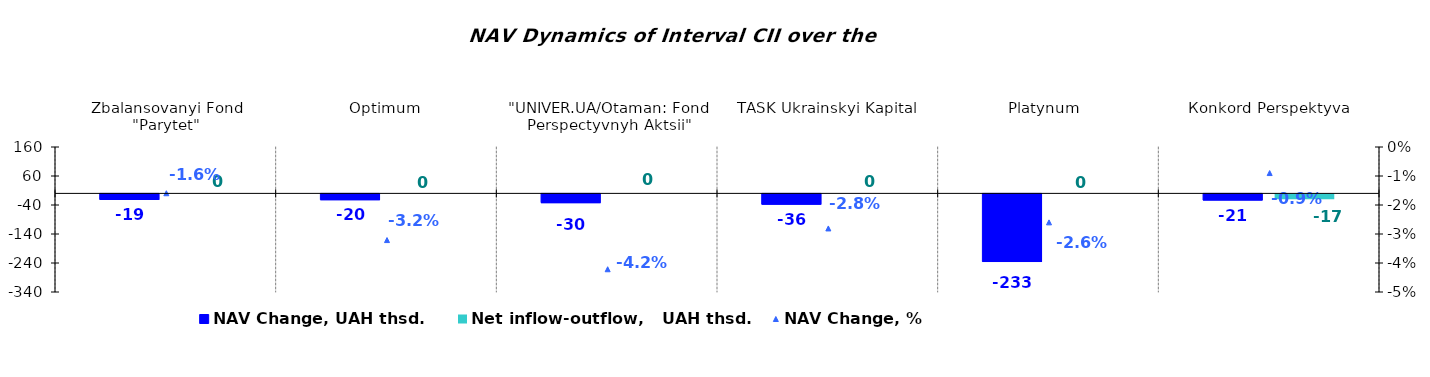
| Category | NAV Change, UAH thsd. | Net inflow-outflow,   UAH thsd. |
|---|---|---|
| Zbalansovanyi Fond "Parytet" | -18.99 | 0 |
| Optimum | -20.089 | 0 |
| "UNIVER.UA/Otaman: Fond Perspectyvnyh Aktsii" | -30.104 | 0 |
| TASK Ukrainskyi Kapital | -35.632 | 0 |
| Platynum  | -233.231 | 0 |
| Кonkord Perspektyva | -21.462 | -16.668 |